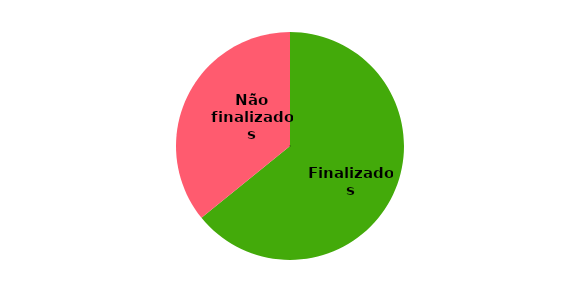
| Category | Series 0 |
|---|---|
| Finalizados | 3221 |
| Não finalizados | 1800 |